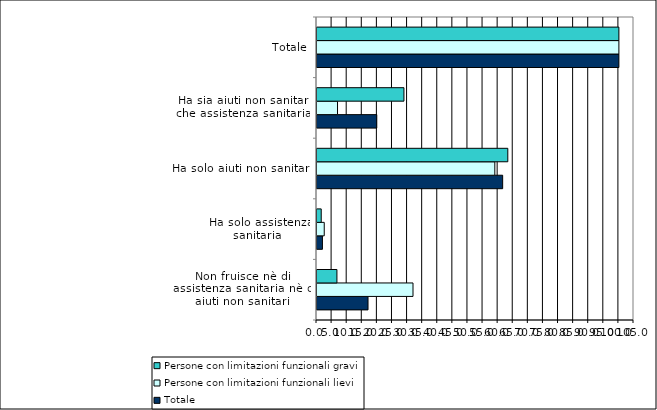
| Category | Totale | Persone con limitazioni funzionali lievi | Persone con limitazioni funzionali gravi |
|---|---|---|---|
| Non fruisce nè di assistenza sanitaria nè di aiuti non sanitari | 16.9 | 31.8 | 6.6 |
| Ha solo assistenza sanitaria  | 1.8 | 2.4 | 1.4 |
| Ha solo aiuti non sanitari | 61.5 | 58.9 | 63.2 |
| Ha sia aiuti non sanitari che assistenza sanitaria  | 19.8 | 6.8 | 28.8 |
| Totale | 100 | 100 | 100 |